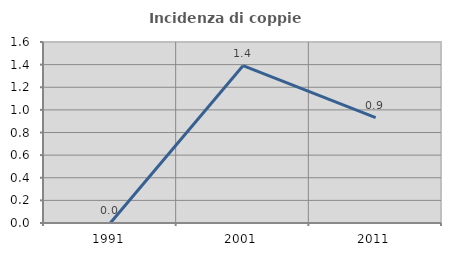
| Category | Incidenza di coppie miste |
|---|---|
| 1991.0 | 0 |
| 2001.0 | 1.391 |
| 2011.0 | 0.932 |